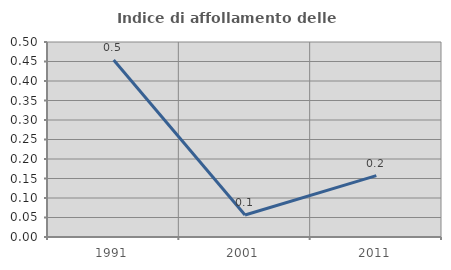
| Category | Indice di affollamento delle abitazioni  |
|---|---|
| 1991.0 | 0.454 |
| 2001.0 | 0.056 |
| 2011.0 | 0.157 |